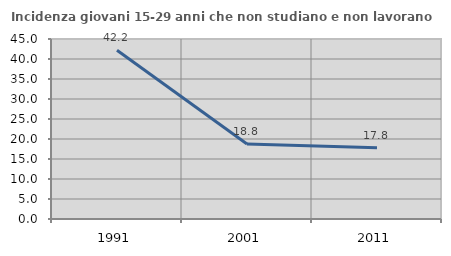
| Category | Incidenza giovani 15-29 anni che non studiano e non lavorano  |
|---|---|
| 1991.0 | 42.176 |
| 2001.0 | 18.762 |
| 2011.0 | 17.805 |